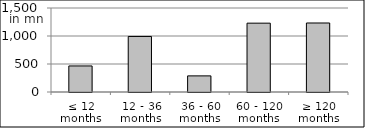
| Category | volume |
|---|---|
| ≤ 12 months | 465158268.71 |
| 12 - 36 months | 991696841.97 |
| 36 - 60 months | 287797113.27 |
| 60 - 120 months | 1229330197.698 |
| ≥ 120 months | 1232359361.933 |